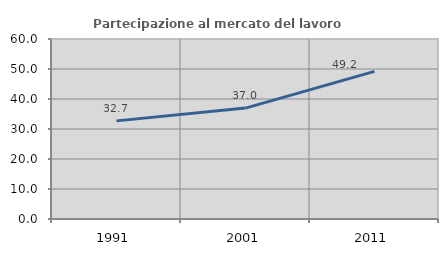
| Category | Partecipazione al mercato del lavoro  femminile |
|---|---|
| 1991.0 | 32.709 |
| 2001.0 | 36.975 |
| 2011.0 | 49.196 |